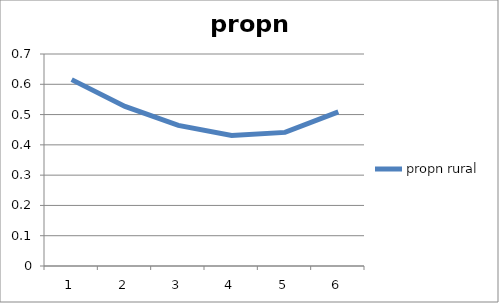
| Category | propn rural |
|---|---|
| 0 | 0.615 |
| 1 | 0.527 |
| 2 | 0.464 |
| 3 | 0.431 |
| 4 | 0.441 |
| 5 | 0.509 |